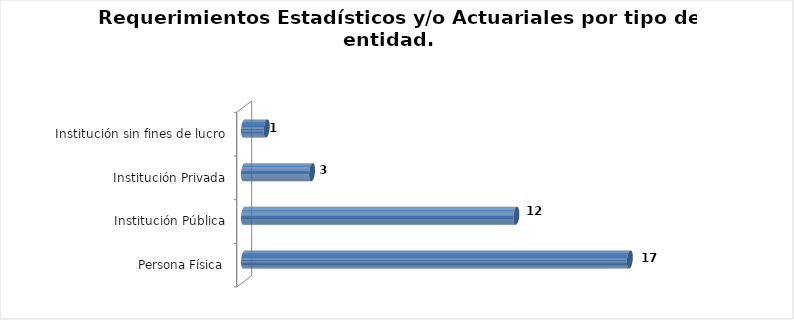
| Category | Total |
|---|---|
| Persona Física | 17 |
| Institución Pública | 12 |
| Institución Privada | 3 |
| Institución sin fines de lucro | 1 |